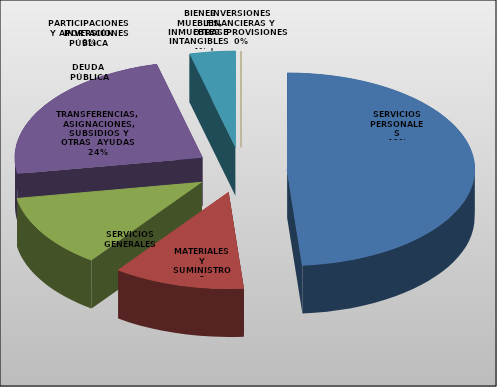
| Category | Series 0 |
|---|---|
| SERVICIOS PERSONALES | 1424848 |
| MATERIALES Y SUMINISTROS | 331000 |
| SERVICIOS GENERALES | 359800 |
| TRANSFERENCIAS, ASIGNACIONES, SUBSIDIOS Y OTRAS  AYUDAS | 694952 |
| BIENES MUEBLES, INMUEBLES E  INTANGIBLES  | 115000 |
| INVERSIÓN PÚBLICA | 0 |
| INVERSIONES FINANCIERAS Y OTRAS PROVISIONES | 0 |
| PARTICIPACIONES Y APORTACIONES | 0 |
| DEUDA  PÚBLICA | 0 |